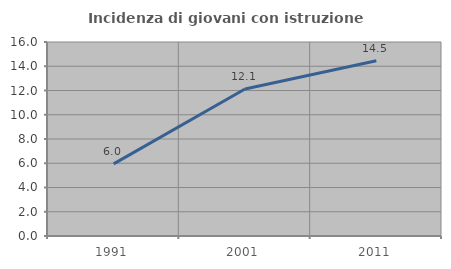
| Category | Incidenza di giovani con istruzione universitaria |
|---|---|
| 1991.0 | 5.952 |
| 2001.0 | 12.121 |
| 2011.0 | 14.458 |